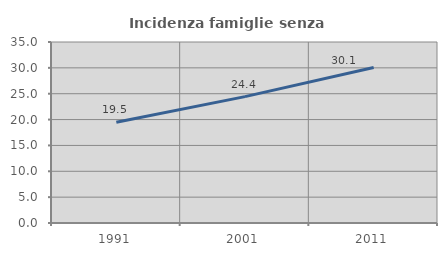
| Category | Incidenza famiglie senza nuclei |
|---|---|
| 1991.0 | 19.484 |
| 2001.0 | 24.433 |
| 2011.0 | 30.075 |